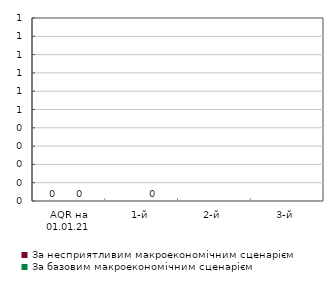
| Category | За несприятливим макроекономічним сценарієм | За базовим макроекономічним сценарієм |
|---|---|---|
| AQR на 01.01.21 | 0 | 0 |
| 1-й | 0 | 0 |
| 2-й | 0 | 0 |
| 3-й | 0 | 0 |